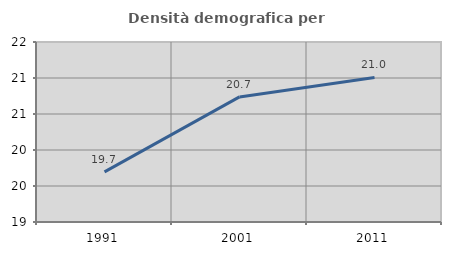
| Category | Densità demografica |
|---|---|
| 1991.0 | 19.697 |
| 2001.0 | 20.738 |
| 2011.0 | 21.007 |